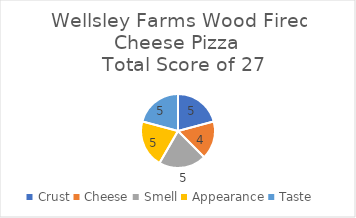
| Category | Series 0 |
|---|---|
| Crust | 5 |
| Cheese | 4 |
| Smell | 5 |
| Appearance | 5 |
| Taste | 5 |